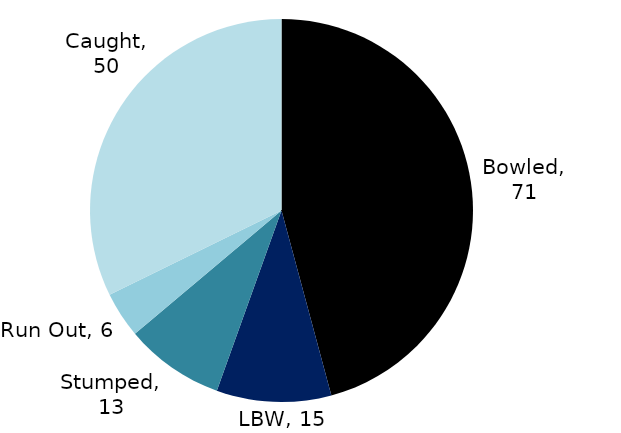
| Category | BOWLING |
|---|---|
| Bowled | 71 |
| LBW | 15 |
| Stumped | 13 |
| Run Out | 6 |
| Caught | 50 |